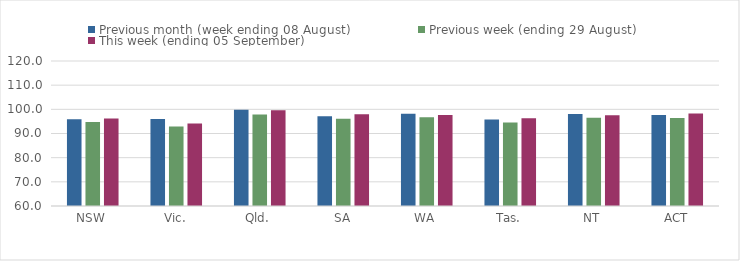
| Category | Previous month (week ending 08 August) | Previous week (ending 29 August) | This week (ending 05 September) |
|---|---|---|---|
| NSW | 95.88 | 94.71 | 96.2 |
| Vic. | 96.02 | 92.94 | 94.16 |
| Qld. | 99.84 | 97.83 | 99.6 |
| SA | 97.17 | 96.07 | 97.93 |
| WA | 98.22 | 96.72 | 97.69 |
| Tas. | 95.84 | 94.57 | 96.3 |
| NT | 98.07 | 96.52 | 97.53 |
| ACT | 97.67 | 96.44 | 98.25 |